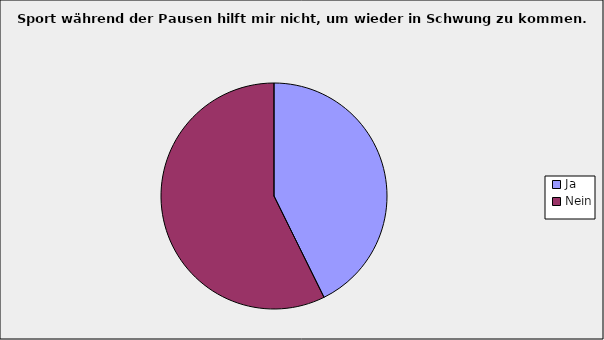
| Category | Series 0 |
|---|---|
| Ja | 0.427 |
| Nein | 0.573 |